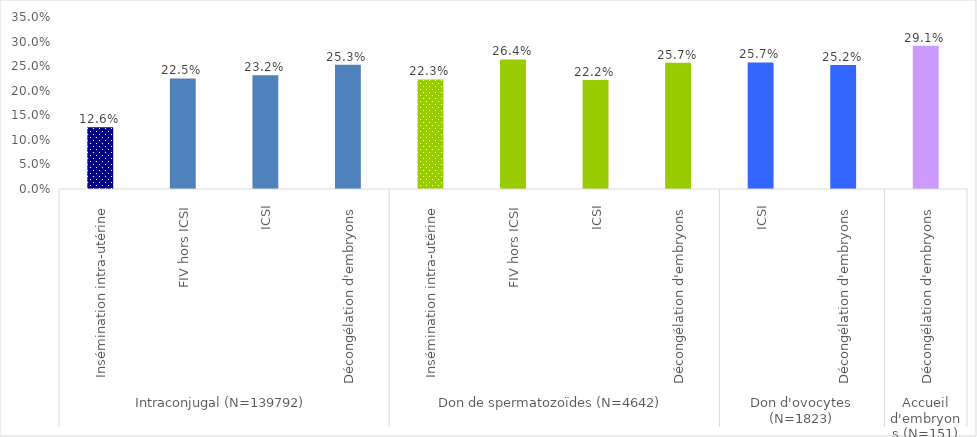
| Category | Series 0 |
|---|---|
| 0 | 0.126 |
| 1 | 0.225 |
| 2 | 0.232 |
| 3 | 0.253 |
| 4 | 0.223 |
| 5 | 0.264 |
| 6 | 0.222 |
| 7 | 0.257 |
| 8 | 0.257 |
| 9 | 0.252 |
| 10 | 0.291 |